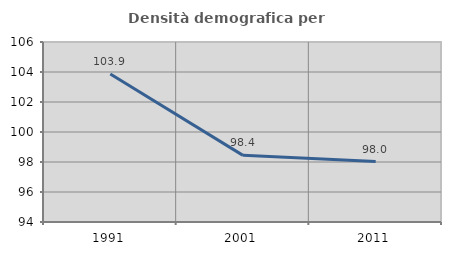
| Category | Densità demografica |
|---|---|
| 1991.0 | 103.863 |
| 2001.0 | 98.443 |
| 2011.0 | 98.028 |